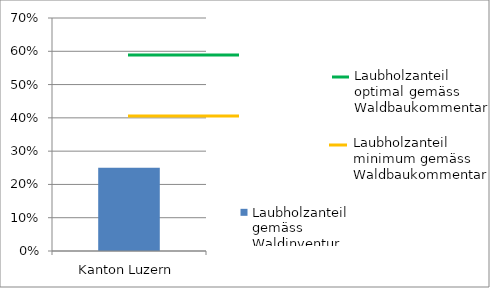
| Category | Laubholzanteil gemäss Waldinventur |
|---|---|
| Kanton Luzern | 0.25 |